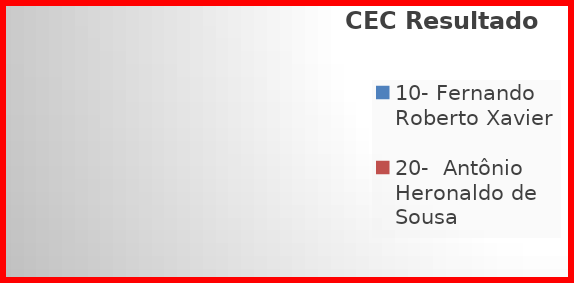
| Category | CEC Resultado Final |
|---|---|
| 10- Fernando Roberto Xavier  | 0 |
| 20-  Antônio Heronaldo de Sousa | 0 |